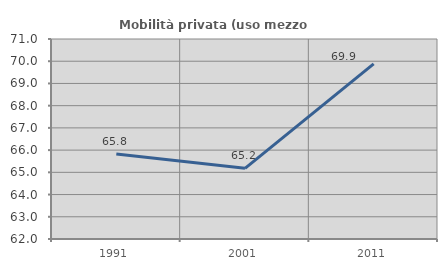
| Category | Mobilità privata (uso mezzo privato) |
|---|---|
| 1991.0 | 65.823 |
| 2001.0 | 65.179 |
| 2011.0 | 69.88 |